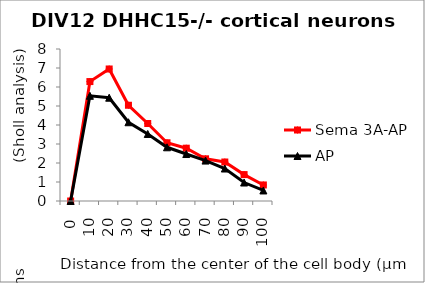
| Category | Sema 3A-AP | AP |
|---|---|---|
| 0.0 | 0 | 0 |
| 10.0 | 6.286 | 5.536 |
| 20.0 | 6.948 | 5.436 |
| 30.0 | 5.039 | 4.145 |
| 40.0 | 4.078 | 3.527 |
| 50.0 | 3.065 | 2.827 |
| 60.0 | 2.779 | 2.473 |
| 70.0 | 2.221 | 2.127 |
| 80.0 | 2.052 | 1.709 |
| 90.0 | 1.39 | 0.973 |
| 100.0 | 0.844 | 0.555 |